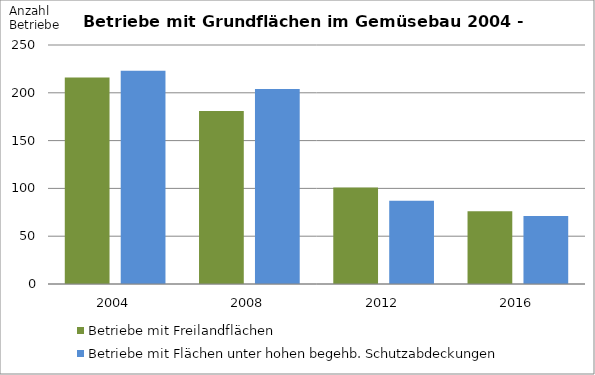
| Category | Betriebe mit Freilandflächen | Betriebe mit Flächen unter hohen begehb. Schutzabdeckungen |
|---|---|---|
| 2004.0 | 216 | 223 |
| 2008.0 | 181 | 204 |
| 2012.0 | 101 | 87 |
| 2016.0 | 76 | 71 |